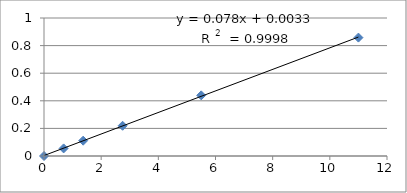
| Category | Series 0 |
|---|---|
| 0.0 | 0 |
| 0.687 | 0.055 |
| 1.37 | 0.111 |
| 2.75 | 0.219 |
| 5.5 | 0.44 |
| 11.0 | 0.858 |